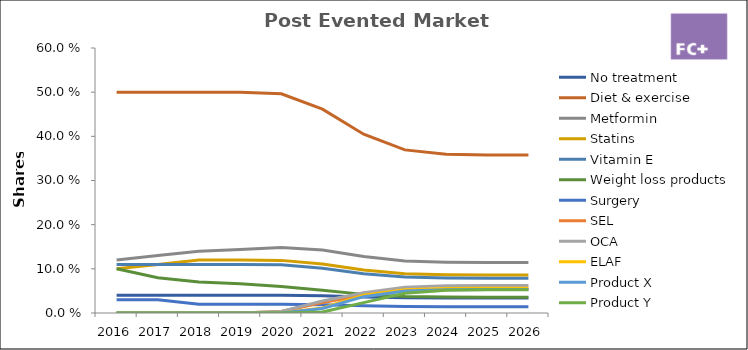
| Category | No treatment | Diet & exercise | Metformin | Statins | Vitamin E | Weight loss products | Surgery | SEL | OCA | ELAF | Product X | Product Y |
|---|---|---|---|---|---|---|---|---|---|---|---|---|
| 2016.0 | 0.04 | 0.5 | 0.12 | 0.1 | 0.11 | 0.1 | 0.03 | 0 | 0 | 0 | 0 | 0 |
| 2017.0 | 0.04 | 0.5 | 0.13 | 0.11 | 0.11 | 0.08 | 0.03 | 0 | 0 | 0 | 0 | 0 |
| 2018.0 | 0.04 | 0.5 | 0.14 | 0.12 | 0.11 | 0.07 | 0.02 | 0 | 0 | 0 | 0 | 0 |
| 2019.0 | 0.04 | 0.5 | 0.144 | 0.12 | 0.11 | 0.066 | 0.02 | 0 | 0 | 0 | 0 | 0 |
| 2020.0 | 0.04 | 0.496 | 0.148 | 0.119 | 0.109 | 0.06 | 0.02 | 0.003 | 0.004 | 0 | 0 | 0 |
| 2021.0 | 0.039 | 0.462 | 0.142 | 0.111 | 0.102 | 0.051 | 0.018 | 0.024 | 0.027 | 0.011 | 0.01 | 0.002 |
| 2022.0 | 0.036 | 0.405 | 0.128 | 0.097 | 0.089 | 0.042 | 0.016 | 0.04 | 0.046 | 0.04 | 0.037 | 0.023 |
| 2023.0 | 0.035 | 0.369 | 0.118 | 0.089 | 0.081 | 0.037 | 0.015 | 0.051 | 0.058 | 0.053 | 0.05 | 0.044 |
| 2024.0 | 0.034 | 0.36 | 0.115 | 0.086 | 0.079 | 0.036 | 0.014 | 0.054 | 0.062 | 0.055 | 0.053 | 0.052 |
| 2025.0 | 0.034 | 0.358 | 0.114 | 0.086 | 0.079 | 0.036 | 0.014 | 0.055 | 0.062 | 0.056 | 0.053 | 0.053 |
| 2026.0 | 0.034 | 0.358 | 0.114 | 0.086 | 0.079 | 0.036 | 0.014 | 0.055 | 0.062 | 0.056 | 0.053 | 0.053 |